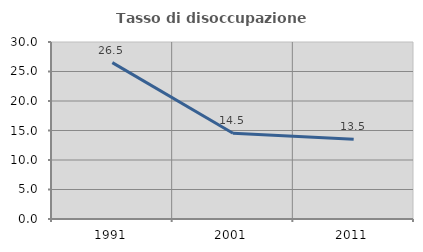
| Category | Tasso di disoccupazione giovanile  |
|---|---|
| 1991.0 | 26.506 |
| 2001.0 | 14.545 |
| 2011.0 | 13.514 |